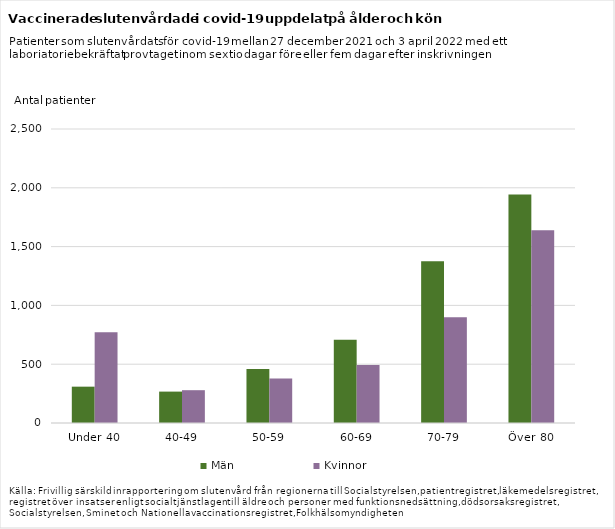
| Category | Män | Kvinnor |
|---|---|---|
| Under 40 | 309 | 772 |
| 40-49 | 267 | 279 |
| 50-59 | 459 | 379 |
| 60-69 | 708 | 494 |
| 70-79 | 1375 | 899 |
| Över 80 | 1944 | 1639 |